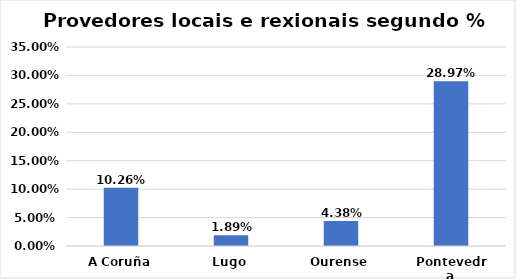
| Category | Series 0 |
|---|---|
| A Coruña | 0.103 |
| Lugo | 0.019 |
| Ourense | 0.044 |
| Pontevedra | 0.29 |